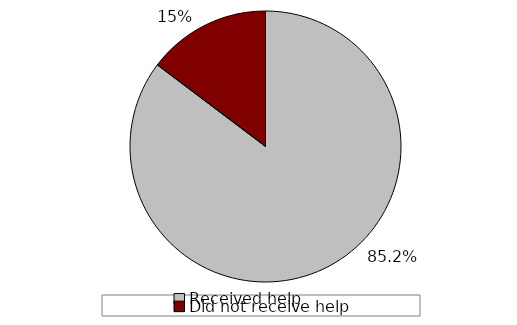
| Category | Series 0 |
|---|---|
| Received help | 0.852 |
| Did not receive help | 0.147 |